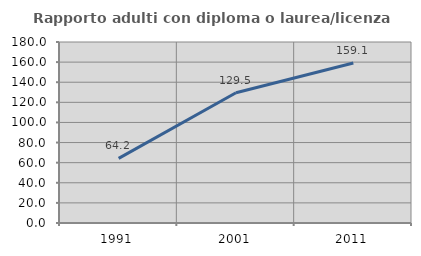
| Category | Rapporto adulti con diploma o laurea/licenza media  |
|---|---|
| 1991.0 | 64.214 |
| 2001.0 | 129.52 |
| 2011.0 | 159.055 |